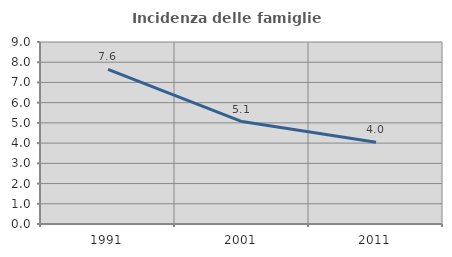
| Category | Incidenza delle famiglie numerose |
|---|---|
| 1991.0 | 7.649 |
| 2001.0 | 5.064 |
| 2011.0 | 4.048 |